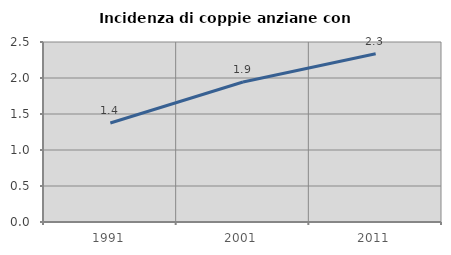
| Category | Incidenza di coppie anziane con figli |
|---|---|
| 1991.0 | 1.376 |
| 2001.0 | 1.944 |
| 2011.0 | 2.336 |